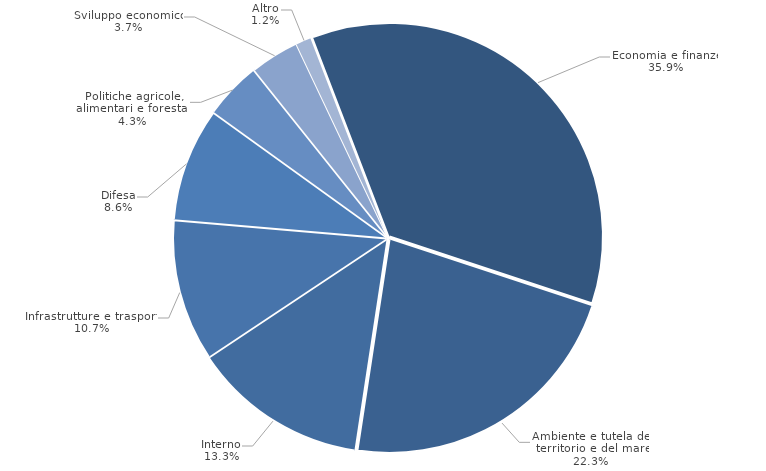
| Category | Series 0 |
|---|---|
| Economia e finanze | 0.359 |
| Ambiente e tutela del territorio e del mare | 0.223 |
| Interno | 0.133 |
| Infrastrutture e trasporti | 0.107 |
| Difesa | 0.086 |
| Politiche agricole, alimentari e forestali | 0.043 |
| Sviluppo economico | 0.037 |
| Altro | 0.012 |